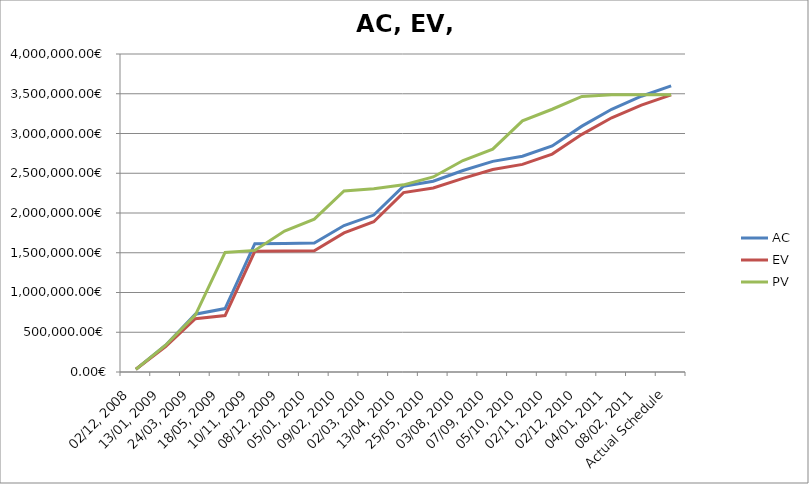
| Category | AC | EV | PV |
|---|---|---|---|
| 02/12, 2008 | 33866.98 | 33866.98 | 33866.98 |
| 13/01, 2009 | 337156.793 | 320689.791 | 337156.793 |
| 24/03, 2009 | 726794.714 | 670533.513 | 716159.514 |
| 18/05, 2009 | 797971.276 | 710076.047 | 1504276.934 |
| 10/11, 2009 | 1613342.616 | 1518567.814 | 1529638.214 |
| 08/12, 2009 | 1617368.216 | 1522257.947 | 1773015.619 |
| 05/01, 2010 | 1621393.816 | 1525948.081 | 1923240.29 |
| 09/02, 2010 | 1841872.421 | 1748850.781 | 2277278.701 |
| 02/03, 2010 | 1974074.691 | 1890278.405 | 2306035.5 |
| 13/04, 2010 | 2336383.103 | 2256840.946 | 2354381.099 |
| 25/05, 2010 | 2400198.302 | 2313830.314 | 2453181.439 |
| 03/08, 2010 | 2535028.56 | 2434896.12 | 2659758.031 |
| 07/09, 2010 | 2649250.511 | 2546680.031 | 2803865.901 |
| 05/10, 2010 | 2713866.512 | 2611296.028 | 3159577.166 |
| 02/11, 2010 | 2843461.984 | 2740891.502 | 3305131.968 |
| 02/12, 2010 | 3092616.446 | 2989691.061 | 3466447.35 |
| 04/01, 2011 | 3304922.448 | 3197915.677 | 3486375.47 |
| 08/02, 2011 | 3468773.651 | 3357330.592 | 3486375.47 |
| Actual Schedule | 3599114.112 | 3486375.47 | 3486375.47 |